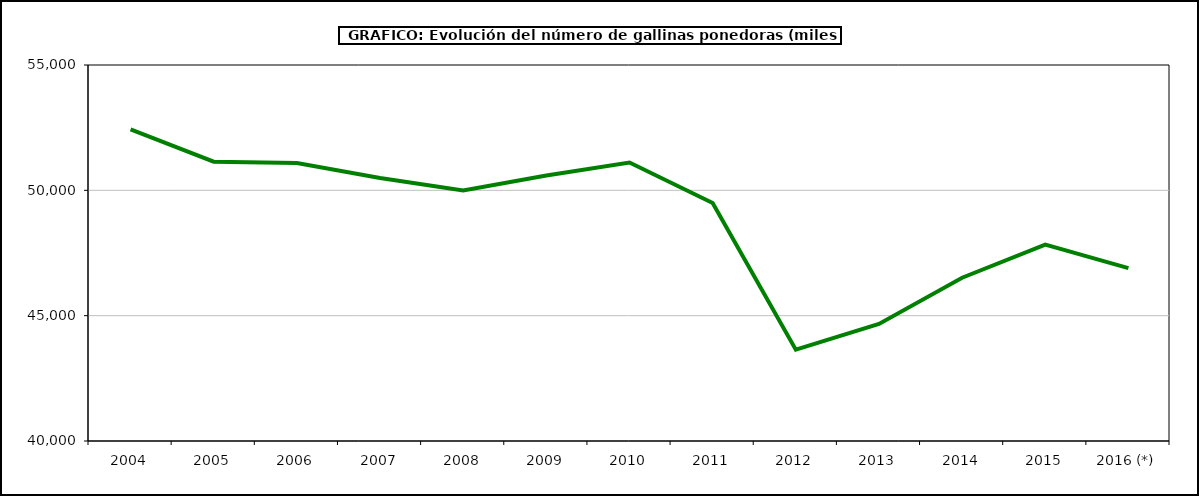
| Category | Huevos gallina |
|---|---|
| 2004 | 52432.67 |
| 2005 | 51141.084 |
| 2006 | 51089.874 |
| 2007 | 50494.963 |
| 2008 | 49994.952 |
| 2009 | 50593.247 |
| 2010 | 51108 |
| 2011 | 49494.204 |
| 2012 | 43642.944 |
| 2013 | 44667.904 |
| 2014 | 46512.999 |
| 2015 | 47835.268 |
| 2016 (*) | 46894.09 |